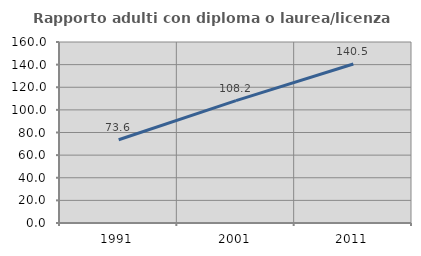
| Category | Rapporto adulti con diploma o laurea/licenza media  |
|---|---|
| 1991.0 | 73.596 |
| 2001.0 | 108.156 |
| 2011.0 | 140.544 |